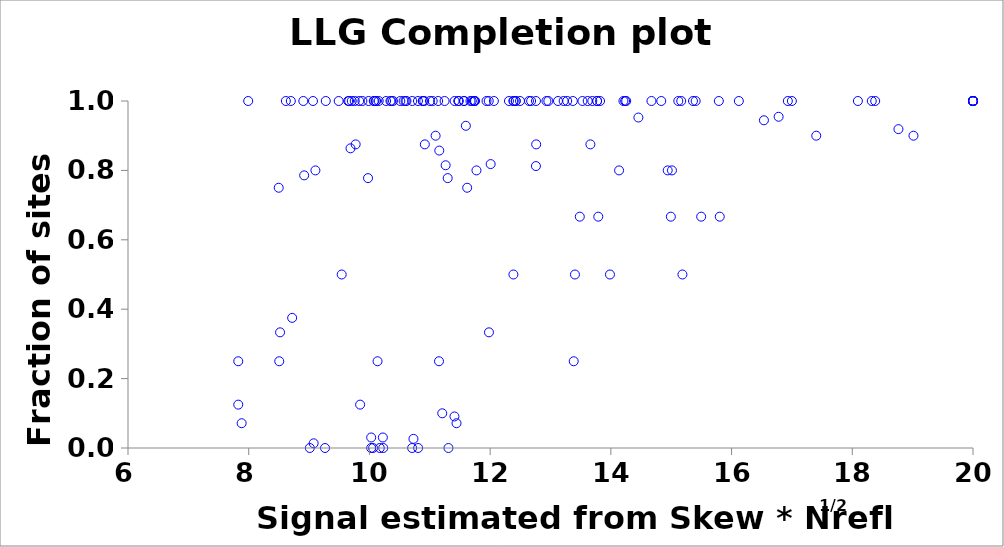
| Category | LLGC |
|---|---|
| 8.904423616349154 | 1 |
| 8.697779380210141 | 1 |
| 9.490647882077923 | 1 |
| 11.69665930433824 | 1 |
| 10.61395477967016 | 1 |
| 11.67437006889784 | 1 |
| 12.75921391640042 | 1 |
| 8.519405599906985 | 0.333 |
| 14.99408381330375 | 0.667 |
| 13.79139357298274 | 0.667 |
| 15.80422534693586 | 0.667 |
| 10.5662667504456 | 1 |
| 9.707329122124598 | 1 |
| 9.276760472811382 | 1 |
| 10.15364060634909 | 1 |
| 9.065034967838178 | 1 |
| 12.42437950123569 | 1 |
| 10.59803504403967 | 1 |
| 14.20822433235694 | 1 |
| 15.78884685155215 | 1 |
| 10.08083246321323 | 1 |
| 12.64375299802683 | 1 |
| 13.82094859272609 | 1 |
| 9.01276312959254 | 0 |
| 10.13446585180813 | 0.25 |
| 8.505853469729152 | 0.25 |
| 11.15258093204675 | 0.25 |
| 13.3848942580256 | 0.25 |
| 13.98501219083193 | 0.5 |
| 15.18565855112216 | 0.5 |
| 13.4051020735917 | 0.5 |
| 8.496951660820404 | 0.75 |
| 11.61949482452974 | 0.75 |
| 7.991362741169836 | 1 |
| 10.39043603432543 | 1 |
| 13.21805657730685 | 1 |
| 10.88406218606673 | 1 |
| 10.90831949223794 | 1 |
| 10.10576290935441 | 1 |
| 12.31190734769541 | 1 |
| 10.51160764154887 | 1 |
| 15.117508678916 | 1 |
| 12.3867081237443 | 1 |
| 13.61614012944304 | 1 |
| 11.56444198989172 | 1 |
| 11.13865208767545 | 1 |
| 13.12428348411071 | 1 |
| 11.24529489072077 | 1 |
| 12.06207263584719 | 1 |
| 9.105141277861739 | 0.8 |
| 14.94178827098643 | 0.8 |
| 15.01218793287842 | 0.8 |
| 11.04763088644734 | 1 |
| 13.69254316214084 | 1 |
| 10.34816997622093 | 1 |
| 10.27594534583927 | 1 |
| 10.36356455425851 | 1 |
| 10.80424595395253 | 1 |
| 10.07148182700858 | 1 |
| 11.7414384666823 | 1 |
| 18.3229925056957 | 1 |
| 13.37029120660925 | 1 |
| 20.0 | 1 |
| 18.37953512487878 | 1 |
| 11.98042953754751 | 0.333 |
| 12.93250887685302 | 1 |
| 11.75005773778657 | 1 |
| 15.1656378020641 | 1 |
| 14.25431250377948 | 1 |
| 16.12065665419265 | 1 |
| 20.0 | 1 |
| 20.0 | 1 |
| 20.0 | 1 |
| 20.0 | 1 |
| 20.0 | 1 |
| 11.30941761137824 | 0 |
| 10.11125425174311 | 1 |
| 10.88440971373654 | 1 |
| 11.0023760359028 | 1 |
| 11.48205771043878 | 1 |
| 11.7294332340968 | 1 |
| 9.264325964957472 | 0 |
| 10.17146151040151 | 0 |
| 7.82663791389178 | 0.125 |
| 9.84590194615479 | 0.125 |
| 7.82663791389178 | 0.25 |
| 8.719594013921085 | 0.375 |
| 16.99925644037305 | 1 |
| 12.38544287893745 | 0.5 |
| 10.91794895541963 | 0.875 |
| 12.76281264826931 | 0.875 |
| 9.66353755373613 | 1 |
| 8.615462146521535 | 1 |
| 10.70942612555771 | 1 |
| 9.648180022666667 | 1 |
| 11.97675695996634 | 1 |
| 9.756517079438307 | 1 |
| 12.38843447677363 | 1 |
| 11.41135324289504 | 1 |
| 11.4707798607688 | 1 |
| 9.986333684675731 | 1 |
| 13.77161248434936 | 1 |
| 11.93981694361301 | 1 |
| 9.8835487959365 | 1 |
| 14.67264207937377 | 1 |
| 9.83022552525119 | 1 |
| 13.48533281163613 | 0.667 |
| 11.29667671994353 | 0.778 |
| 16.93229603251613 | 1 |
| 11.2064337999266 | 0.1 |
| 9.540444998563824 | 0.5 |
| 11.7734186167464 | 0.8 |
| 14.13630382894294 | 0.8 |
| 11.09651690554001 | 0.9 |
| 19.01367070708936 | 0.9 |
| 17.40306304519538 | 0.9 |
| 14.83491115172147 | 1 |
| 10.02803867466331 | 0 |
| 11.40863957851593 | 0.091 |
| 12.00851427840937 | 0.818 |
| 18.09307497944226 | 1 |
| 20.0 | 1 |
| 13.77187742688815 | 1 |
| 13.27655468752768 | 1 |
| 12.49476554361105 | 1 |
| 11.73375921710938 | 1 |
| 12.42360379729368 | 1 |
| 12.9640258385667 | 1 |
| 12.6788838197101 | 1 |
| 7.883049817296589 | 0.071 |
| 11.44292679262981 | 0.071 |
| 8.918744279058181 | 0.786 |
| 11.15741080555995 | 0.857 |
| 11.59790984904862 | 0.929 |
| 15.36054339189891 | 1 |
| 15.40492305384931 | 1 |
| 11.56903976710047 | 1 |
| 20.0 | 1 |
| 20.0 | 1 |
| 20.0 | 1 |
| 12.75886077509668 | 0.812 |
| 13.66107270546395 | 0.875 |
| 9.772040746966333 | 0.875 |
| 13.52906309898512 | 1 |
| 16.53601177869234 | 0.944 |
| 20.0 | 1 |
| 14.45629138103512 | 0.952 |
| 14.23632654399194 | 1 |
| 9.686537533060166 | 0.864 |
| 16.77948982679185 | 0.955 |
| 10.70722373944662 | 0 |
| 9.976641804549624 | 0.778 |
| 11.26279669842417 | 0.815 |
| 10.22254344480292 | 0.03 |
| 10.02888090151726 | 0.03 |
| 15.49638509411768 | 0.667 |
| 10.80663247533288 | 0 |
| 10.72943764009707 | 0.026 |
| 10.05964283486379 | 0 |
| 10.22839330216725 | 0 |
| 9.076096373048316 | 0.014 |
| 18.76489398002018 | 0.919 |